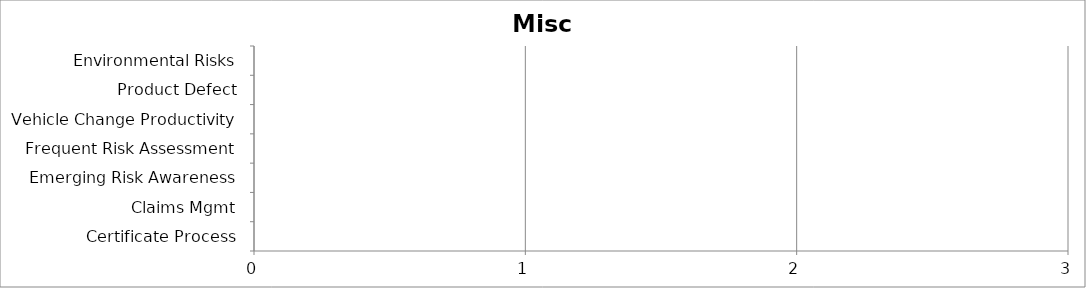
| Category | Low | Medium | High |
|---|---|---|---|
| Certificate Process | 0 | 0 | 0 |
| Claims Mgmt | 0 | 0 | 0 |
| Emerging Risk Awareness | 0 | 0 | 0 |
| Frequent Risk Assessment | 0 | 0 | 0 |
| Vehicle Change Productivity | 0 | 0 | 0 |
| Product Defect | 0 | 0 | 0 |
| Environmental Risks | 0 | 0 | 0 |